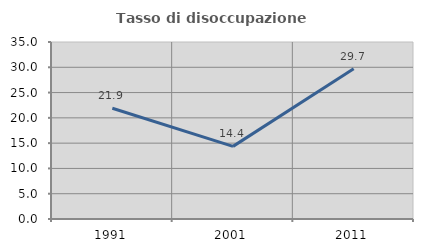
| Category | Tasso di disoccupazione giovanile  |
|---|---|
| 1991.0 | 21.896 |
| 2001.0 | 14.362 |
| 2011.0 | 29.724 |